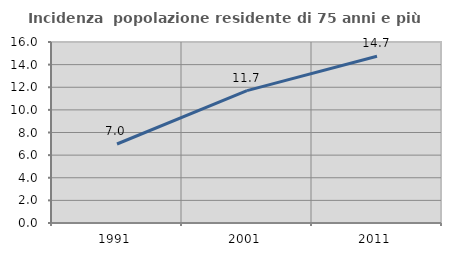
| Category | Incidenza  popolazione residente di 75 anni e più |
|---|---|
| 1991.0 | 6.983 |
| 2001.0 | 11.705 |
| 2011.0 | 14.744 |